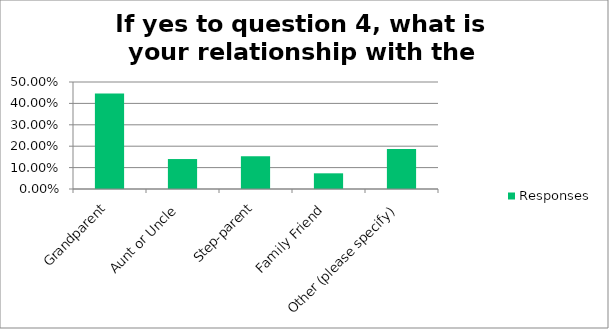
| Category | Responses |
|---|---|
| Grandparent | 0.447 |
| Aunt or Uncle | 0.14 |
| Step-parent | 0.153 |
| Family Friend | 0.073 |
| Other (please specify) | 0.187 |